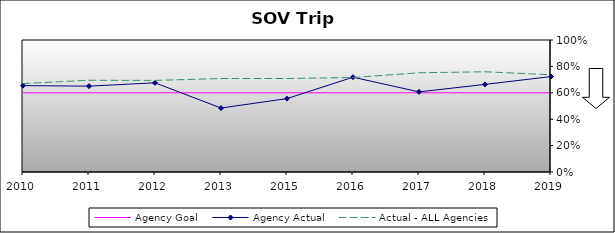
| Category | Agency Goal | Agency Actual | Actual - ALL Agencies |
|---|---|---|---|
| 2010.0 | 0.6 | 0.654 | 0.67 |
| 2011.0 | 0.6 | 0.65 | 0.695 |
| 2012.0 | 0.6 | 0.676 | 0.694 |
| 2013.0 | 0.6 | 0.485 | 0.708 |
| 2015.0 | 0.6 | 0.556 | 0.708 |
| 2016.0 | 0.6 | 0.718 | 0.716 |
| 2017.0 | 0.6 | 0.607 | 0.752 |
| 2018.0 | 0.6 | 0.664 | 0.759 |
| 2019.0 | 0.6 | 0.723 | 0.736 |